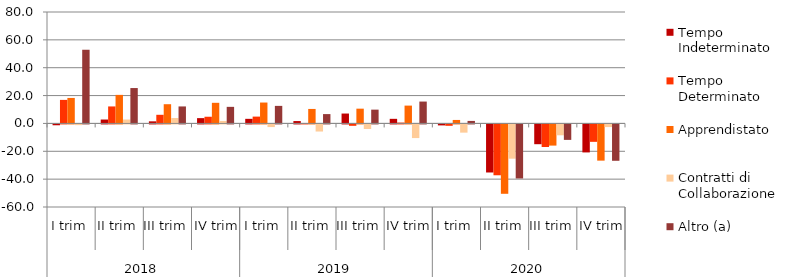
| Category | Tempo Indeterminato | Tempo Determinato | Apprendistato  | Contratti di Collaborazione | Altro (a) |
|---|---|---|---|---|---|
| 0 | -0.6 | 16.9 | 18.3 | -0.5 | 52.9 |
| 1 | 2.8 | 12.2 | 20.5 | 2.8 | 25.4 |
| 2 | 1.5 | 6.2 | 13.8 | 3.9 | 12.2 |
| 3 | 3.8 | 4.8 | 14.8 | 1.8 | 11.9 |
| 4 | 3.3 | 4.9 | 15 | -1.9 | 12.6 |
| 5 | 1.7 | 0.1 | 10.4 | -5.1 | 6.7 |
| 6 | 7.1 | -1 | 10.6 | -3.3 | 9.9 |
| 7 | 3.3 | 0.6 | 12.8 | -9.8 | 15.7 |
| 8 | -0.7 | -1 | 2.5 | -5.9 | 1.8 |
| 9 | -34.5 | -36.5 | -49.8 | -24.6 | -38.8 |
| 10 | -14.2 | -16.2 | -15.2 | -7.8 | -11.1 |
| 11 | -20.1 | -12.5 | -26 | -1.9 | -26.1 |